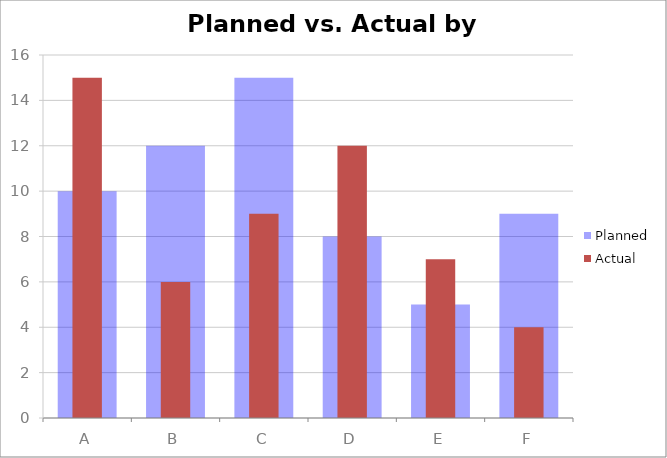
| Category | Planned |
|---|---|
| A | 10 |
| B | 12 |
| C | 15 |
| D | 8 |
| E | 5 |
| F | 9 |